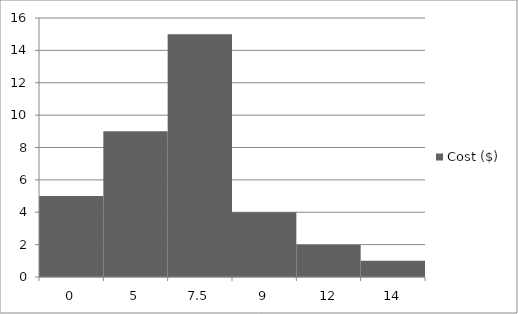
| Category | Cost ($) |
|---|---|
| 0.0 | 5 |
| 5.0 | 9 |
| 7.5 | 15 |
| 9.0 | 4 |
| 12.0 | 2 |
| 14.0 | 1 |